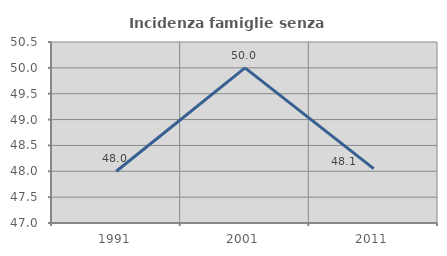
| Category | Incidenza famiglie senza nuclei |
|---|---|
| 1991.0 | 48 |
| 2001.0 | 50 |
| 2011.0 | 48.052 |